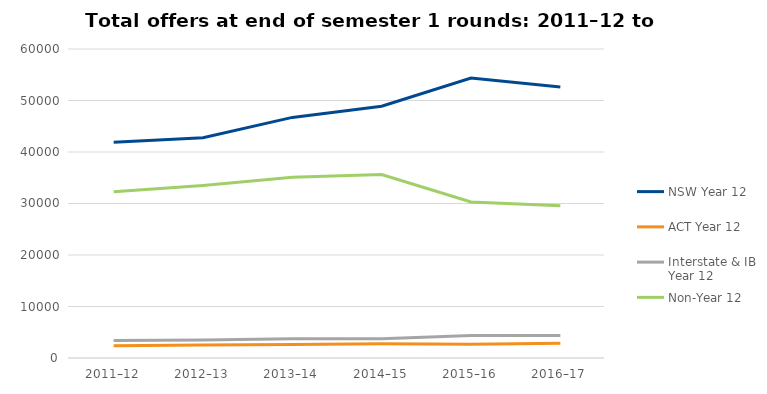
| Category | NSW Year 12 | ACT Year 12 | Interstate & IB Year 12 | Non-Year 12 |
|---|---|---|---|---|
| 2011–12 | 41896 | 2366 | 3400 | 32298 |
| 2012–13 | 42771 | 2529 | 3513 | 33507 |
| 2013–14 | 46721 | 2637 | 3729 | 35096 |
| 2014–15 | 48880 | 2769 | 3747 | 35640 |
| 2015–16 | 54347 | 2668 | 4356 | 30300 |
| 2016–17 | 52601 | 2859 | 4360 | 29553 |